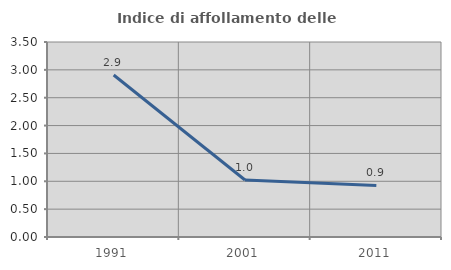
| Category | Indice di affollamento delle abitazioni  |
|---|---|
| 1991.0 | 2.908 |
| 2001.0 | 1.023 |
| 2011.0 | 0.926 |